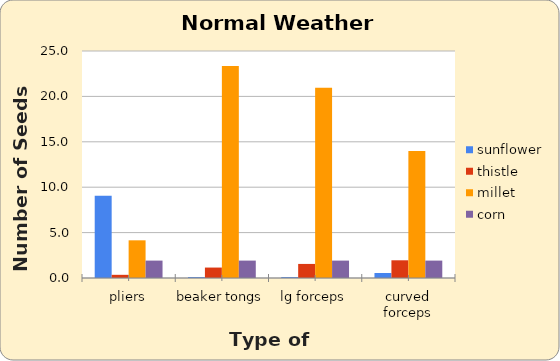
| Category | sunflower | thistle | millet | corn |
|---|---|---|---|---|
| pliers | 9.05 | 0.35 | 4.15 | 1.917 |
| beaker tongs | 0.1 | 1.15 | 23.35 | 1.917 |
| lg forceps | 0.1 | 1.55 | 20.95 | 1.917 |
| curved forceps | 0.55 | 1.95 | 14 | 1.917 |